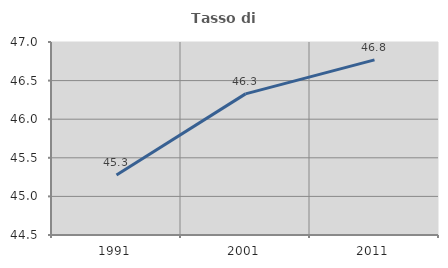
| Category | Tasso di occupazione   |
|---|---|
| 1991.0 | 45.276 |
| 2001.0 | 46.328 |
| 2011.0 | 46.768 |